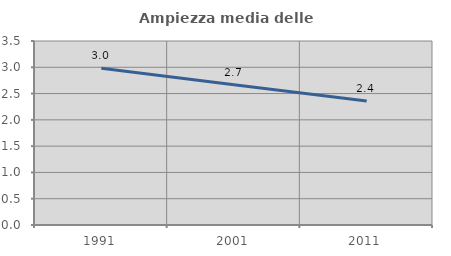
| Category | Ampiezza media delle famiglie |
|---|---|
| 1991.0 | 2.982 |
| 2001.0 | 2.668 |
| 2011.0 | 2.359 |